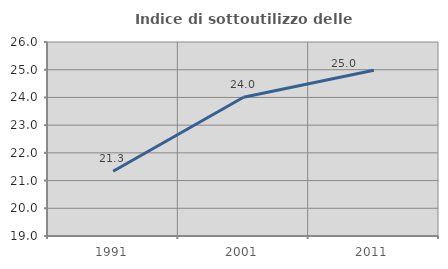
| Category | Indice di sottoutilizzo delle abitazioni  |
|---|---|
| 1991.0 | 21.339 |
| 2001.0 | 24.008 |
| 2011.0 | 24.981 |